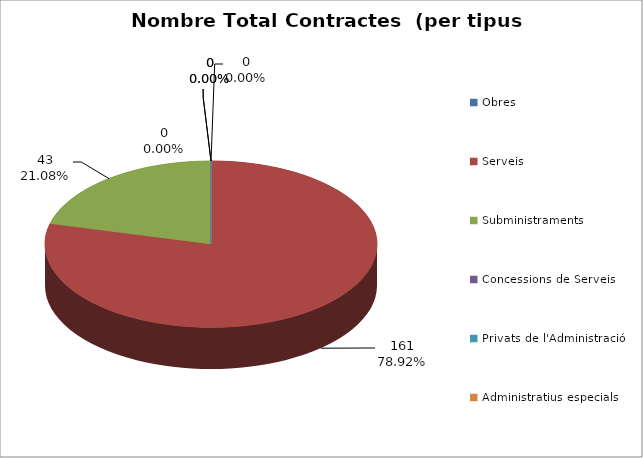
| Category | Nombre Total Contractes |
|---|---|
| Obres | 0 |
| Serveis | 161 |
| Subministraments | 43 |
| Concessions de Serveis | 0 |
| Privats de l'Administració | 0 |
| Administratius especials | 0 |